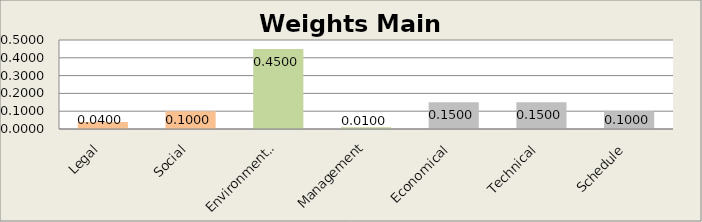
| Category | Main Modules |
|---|---|
| Legal | 0.04 |
| Social | 0.1 |
| Environmental | 0.45 |
| Management | 0.01 |
| Economical | 0.15 |
| Technical | 0.15 |
| Schedule | 0.1 |